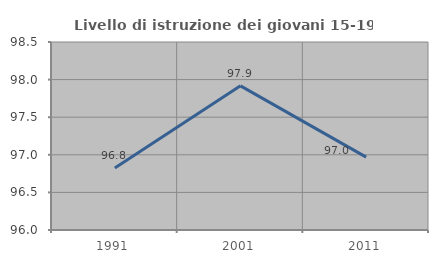
| Category | Livello di istruzione dei giovani 15-19 anni |
|---|---|
| 1991.0 | 96.825 |
| 2001.0 | 97.917 |
| 2011.0 | 96.97 |